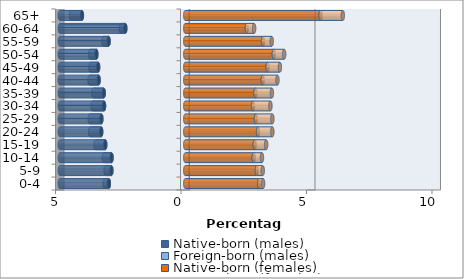
| Category | Native-born (males) | Foreign-born (males) | Native-born (females) | Foreign-born (females) |
|---|---|---|---|---|
| 0-4 | -3.044 | -0.164 | 2.943 | 0.159 |
| 5-9 | -2.942 | -0.23 | 2.853 | 0.235 |
| 10-14 | -2.937 | -0.307 | 2.728 | 0.328 |
| 15-19 | -3.187 | -0.386 | 2.77 | 0.453 |
| 20-24 | -3.348 | -0.439 | 2.9 | 0.569 |
| 25-29 | -3.342 | -0.463 | 2.814 | 0.657 |
| 30-34 | -3.236 | -0.456 | 2.702 | 0.692 |
| 35-39 | -3.247 | -0.415 | 2.799 | 0.653 |
| 40-44 | -3.451 | -0.364 | 3.089 | 0.584 |
| 45-49 | -3.471 | -0.305 | 3.282 | 0.489 |
| 50-54 | -3.541 | -0.251 | 3.528 | 0.413 |
| 55-59 | -3.054 | -0.204 | 3.098 | 0.347 |
| 60-64 | -2.388 | -0.175 | 2.455 | 0.289 |
| 65+ | -4.117 | -0.427 | 5.393 | 0.885 |